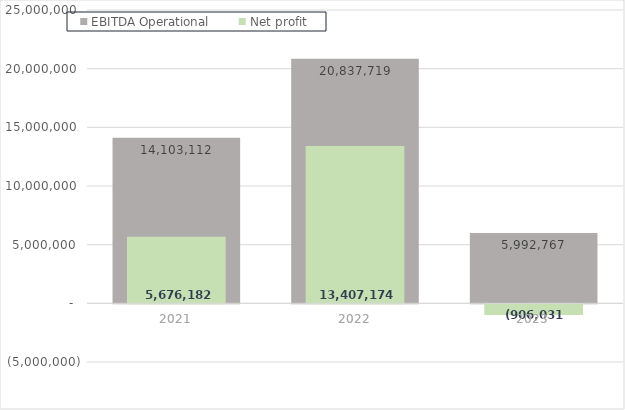
| Category | EBITDA Operational |
|---|---|
| 2021.0 | 14103111.729 |
| 2022.0 | 20837718.806 |
| 2023.0 | 5992766.688 |